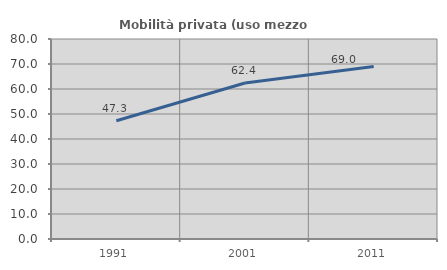
| Category | Mobilità privata (uso mezzo privato) |
|---|---|
| 1991.0 | 47.285 |
| 2001.0 | 62.399 |
| 2011.0 | 69.008 |